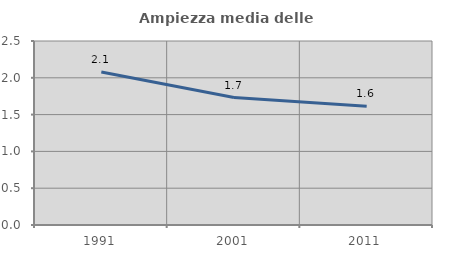
| Category | Ampiezza media delle famiglie |
|---|---|
| 1991.0 | 2.08 |
| 2001.0 | 1.731 |
| 2011.0 | 1.615 |